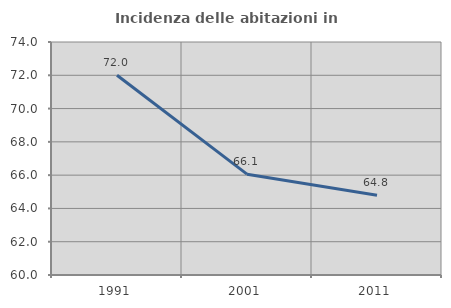
| Category | Incidenza delle abitazioni in proprietà  |
|---|---|
| 1991.0 | 72 |
| 2001.0 | 66.058 |
| 2011.0 | 64.789 |